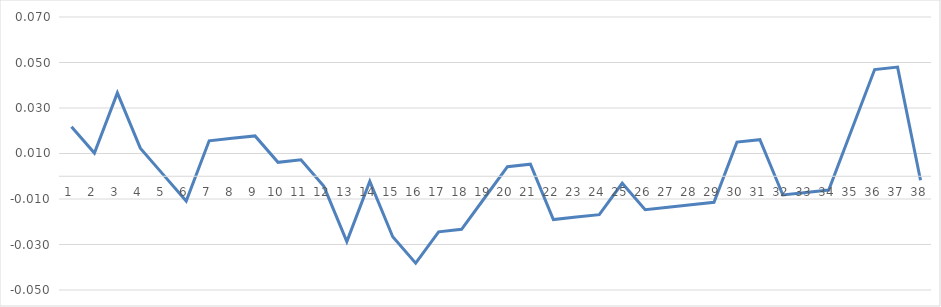
| Category | Series 0 |
|---|---|
| 0 | 0.022 |
| 1 | 0.01 |
| 2 | 0.037 |
| 3 | 0.012 |
| 4 | 0.001 |
| 5 | -0.011 |
| 6 | 0.016 |
| 7 | 0.017 |
| 8 | 0.018 |
| 9 | 0.006 |
| 10 | 0.007 |
| 11 | -0.004 |
| 12 | -0.029 |
| 13 | -0.002 |
| 14 | -0.027 |
| 15 | -0.038 |
| 16 | -0.024 |
| 17 | -0.023 |
| 18 | -0.01 |
| 19 | 0.004 |
| 20 | 0.005 |
| 21 | -0.019 |
| 22 | -0.018 |
| 23 | -0.017 |
| 24 | -0.003 |
| 25 | -0.015 |
| 26 | -0.014 |
| 27 | -0.013 |
| 28 | -0.011 |
| 29 | 0.015 |
| 30 | 0.016 |
| 31 | -0.008 |
| 32 | -0.007 |
| 33 | -0.006 |
| 34 | 0.02 |
| 35 | 0.047 |
| 36 | 0.048 |
| 37 | -0.002 |